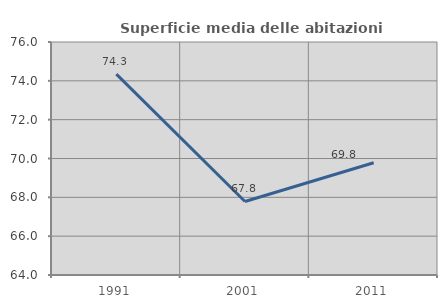
| Category | Superficie media delle abitazioni occupate |
|---|---|
| 1991.0 | 74.347 |
| 2001.0 | 67.785 |
| 2011.0 | 69.778 |